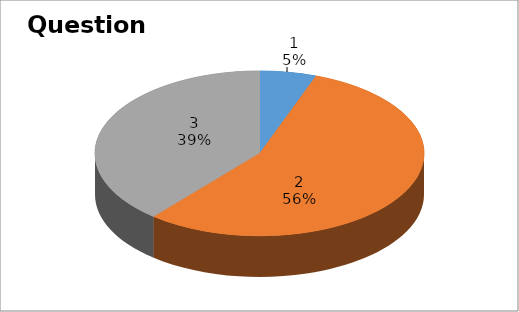
| Category | Series 0 |
|---|---|
| 0 | 1 |
| 1 | 10 |
| 2 | 7 |